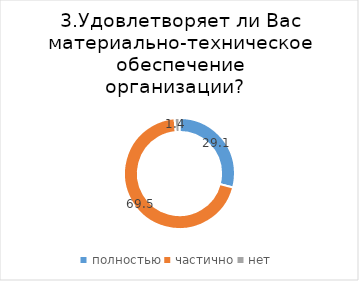
| Category | Series 0 |
|---|---|
| полностью | 29.078 |
| частично | 69.504 |
| нет | 1.418 |